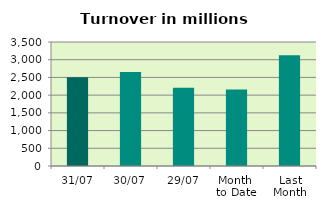
| Category | Series 0 |
|---|---|
| 31/07 | 2502.556 |
| 30/07 | 2650.801 |
| 29/07 | 2206.061 |
| Month 
to Date | 2162.227 |
| Last
Month | 3125.172 |